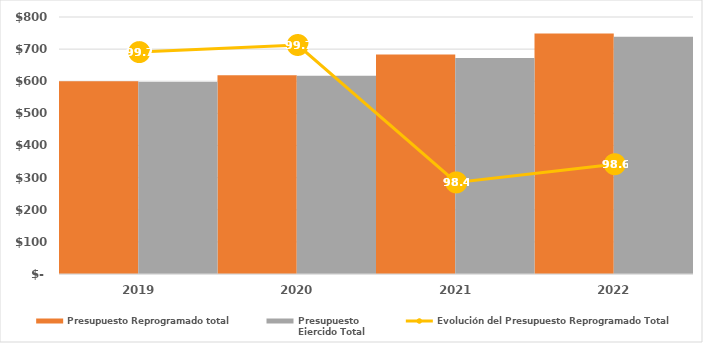
| Category | Presupuesto Reprogramado total | Presupuesto
Ejercido Total |
|---|---|---|
| 2019.0 | 600089.527 | 598040.902 |
| 2020.0 | 619034.656 | 617347.742 |
| 2021.0 | 683166.418 | 672172.234 |
| 2022.0 | 748930.345 | 738205.545 |